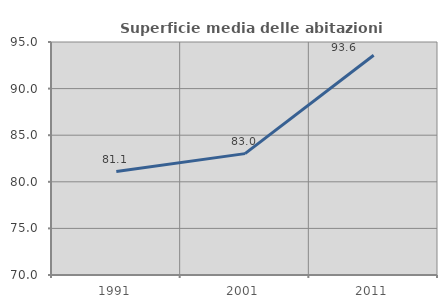
| Category | Superficie media delle abitazioni occupate |
|---|---|
| 1991.0 | 81.105 |
| 2001.0 | 83.023 |
| 2011.0 | 93.574 |